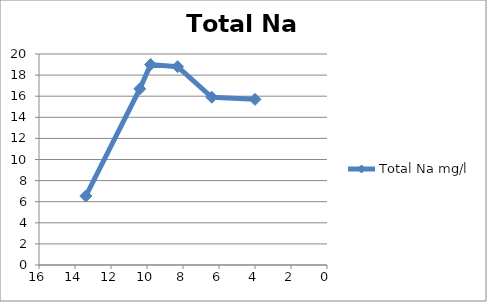
| Category | Total Na mg/l |
|---|---|
| 13.4 | 6.54 |
| 10.4 | 16.7 |
| 9.8 | 19 |
| 8.3 | 18.8 |
| 6.4 | 15.9 |
| 4.0 | 15.7 |